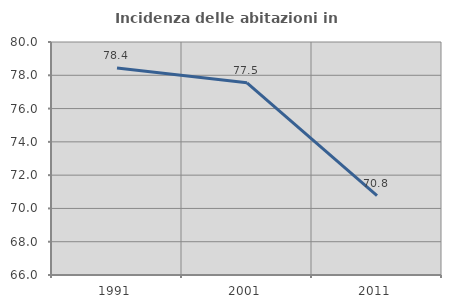
| Category | Incidenza delle abitazioni in proprietà  |
|---|---|
| 1991.0 | 78.434 |
| 2001.0 | 77.549 |
| 2011.0 | 70.77 |